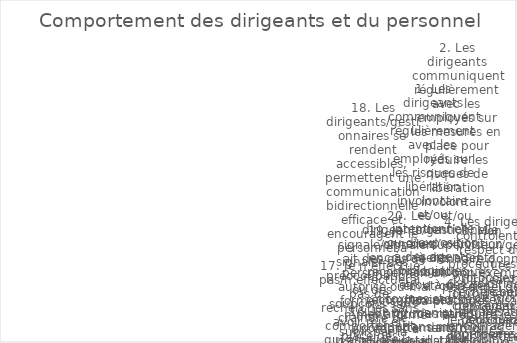
| Category | Series 0 |
|---|---|
| 1. Les dirigeants communiquent régulièrement avec les employés sur les risques de libération involontaire et/ou intentionnelle ou d’exposition à des agents biologiques et/ou à des toxines stockés ou manipulés dans mon installation. | 3 |
| 2. Les dirigeants communiquent régulièrement avec les employés sur les mesures en place pour réduire les risques de libération involontaire et/ou intentionnelle ou d’exposition à des agents biologiques et/ou à des toxines stockés ou manipulés dans mon ins | 4 |
| 3. Mon superviseur/gestionnaire donne un bon exemple personnel de pratiques visant à réduire les risques biologiques. | 3 |
| 4. Les dirigeants contrôlent le respect des procédures (ou protocoles de recherche) et des règles de conduite approuvées/validées. | 0 |
| 5. Les dirigeants fournissent les moyens nécessaires pour mettre en œuvre des mesures de biosécurité et de biosûreté. | 3 |
| 6. Les dirigeants de mon organisation encouragent les employés à accroître leur éducation et leur sensibilisation aux risques biologiques. | 2 |
| 7. Je suis convaincu que je peux déclarer moi-même une maladie ou d’autres conditions susceptibles d’affecter la biosécurité/biosûreté sans crainte de perdre mon emploi ni d’autres effets négatifs sur ma vie professionnelle/ma carrière.  | 0 |
| 8. Il n’est jamais approprié de suivre (« ferroutage ») un employé autorisé à entrer dans une zone réglementée. | 1 |
| 9. Je signale/signalerait un comportement inhabituel de mes collègues qui augmente le risque de libération involontaire et/ou intentionnelle d’agents biologiques et/ou de toxines, ou d’exposition à ces agents. | 4 |
| 10. Je suis engagé dans les processus d’évaluation des risques et de prise de décision pour réduire le risque de libération involontaire et/ou intentionnelle d’agents biologiques et/ou de toxines stockés ou manipulés dans mon installation. | 3 |
| 11. Mon organisation valorise la vigilance en matière de biosécurité et de biosûreté. | 4 |
| 12. Dans mon organisation, des mesures sont en place pour punir les violations délibérées de la biosécurité et de la biosûreté. | 3 |
| 13. Les dirigeants communiquent avec le personnel sur les attentes de performance spécifiques dans les domaines qui affectent la biosécurité et la biosûreté. | 3 |
| 14. Les employés participent aux processus d’évaluation des risques et de prise de décision et aux autres activités qui les concernent.  | 5 |
| 15. Tout le monde dans mon installation dispose correctement des matériaux contaminés. | 2 |
| 16. Un comportement qui améliore la culture de biosécurité et de biosûreté est renforcé par mes pairs. | 0 |
| 17. Je n’effectue pas/n’effectuerai pas de recherches sans avoir mis en place des mesures appropriées d’atténuation de risques. | 1 |
| 18. Les dirigeants/gestionnaires se rendent accessibles, permettent une communication bidirectionnelle efficace et encouragent le personnel à signaler des préoccupations ou des soupçons sans craindre de subir par la suite des mesures disciplinaires4. | 5 |
| 19. Je signale/signalerait des cas de personnel non autorisé ou mal formé/insuffisamment formé accédant à l’établissement.  | 1 |
| 20. Les dirigeants/gestionnaires encouragent, reconnaissent et récompensent les attitudes et comportements louables. | 1 |